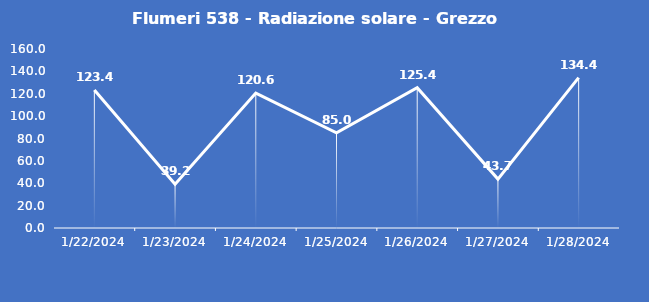
| Category | Flumeri 538 - Radiazione solare - Grezzo (W/m2) |
|---|---|
| 1/22/24 | 123.4 |
| 1/23/24 | 39.2 |
| 1/24/24 | 120.6 |
| 1/25/24 | 85 |
| 1/26/24 | 125.4 |
| 1/27/24 | 43.7 |
| 1/28/24 | 134.4 |